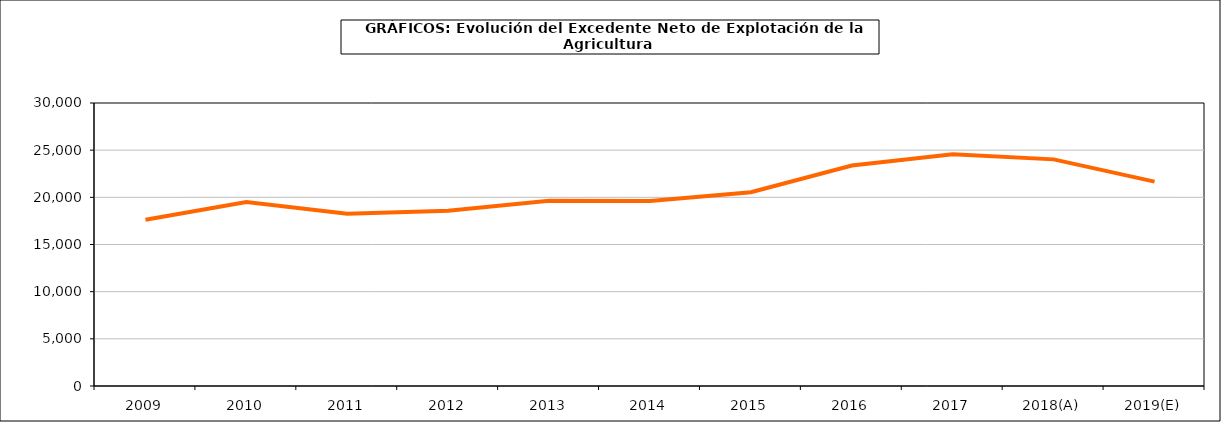
| Category | excedente neto de explotacion |
|---|---|
| 2009 | 17624.014 |
| 2010 | 19508.768 |
| 2011 | 18252.686 |
| 2012 | 18589.082 |
| 2013 | 19635.617 |
| 2014 | 19616.041 |
| 2015 | 20539.815 |
| 2016 | 23367.672 |
| 2017 | 24560.03 |
| 2018(A) | 24024.983 |
| 2019(E) | 21662.242 |